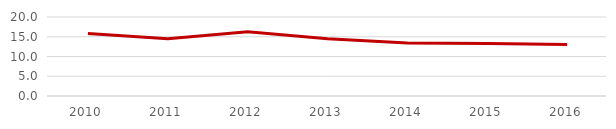
| Category | Proporción del Gasto en Servicios del Gasto Total |
|---|---|
| 2010.0 | 15.842 |
| 2011.0 | 14.514 |
| 2012.0 | 16.248 |
| 2013.0 | 14.518 |
| 2014.0 | 13.389 |
| 2015.0 | 13.273 |
| 2016.0 | 13.024 |